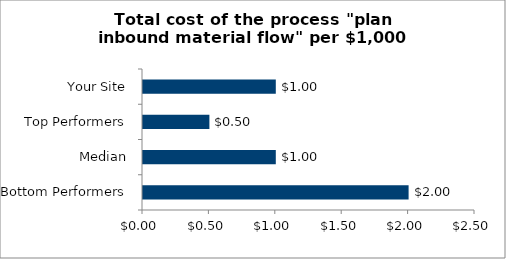
| Category | Series 0 |
|---|---|
| Bottom Performers | 2 |
| Median | 1 |
| Top Performers | 0.5 |
| Your Site | 1 |